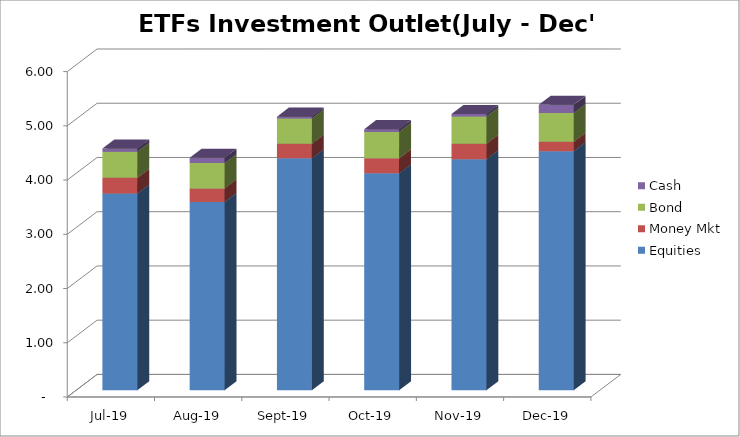
| Category | Equities | Money Mkt | Bond | Cash |
|---|---|---|---|---|
| 2019-07-01 | 3626542879.42 | 289258119.71 | 479657875.89 | 61469802.89 |
| 2019-08-01 | 3470989519.07 | 248600081.58 | 468259884.71 | 98425220.25 |
| 2019-09-01 | 4275169260.79 | 268651365.85 | 465259955.14 | 35225532.29 |
| 2019-10-01 | 3998481766.57 | 276775288.51 | 488154889.65 | 50379881.56 |
| 2019-11-01 | 4258053610.08 | 285466996.9 | 503321320.85 | 44585809.67 |
| 2019-12-01 | 4408225444.33 | 171857896.38 | 529473292.36 | 151803547.97 |